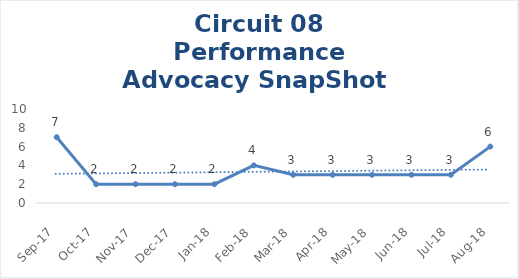
| Category | Circuit 08 |
|---|---|
| Sep-17 | 7 |
| Oct-17 | 2 |
| Nov-17 | 2 |
| Dec-17 | 2 |
| Jan-18 | 2 |
| Feb-18 | 4 |
| Mar-18 | 3 |
| Apr-18 | 3 |
| May-18 | 3 |
| Jun-18 | 3 |
| Jul-18 | 3 |
| Aug-18 | 6 |